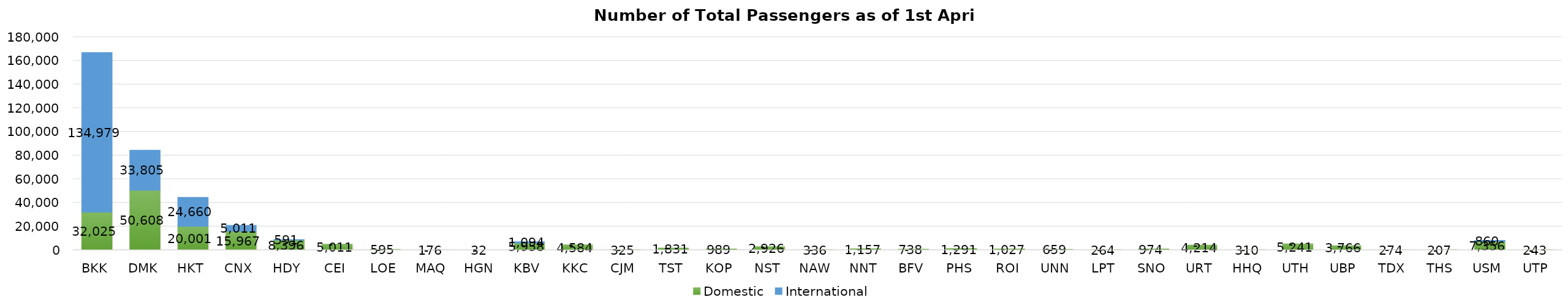
| Category | Domestic | International |
|---|---|---|
| BKK | 32025 | 134979 |
| DMK | 50608 | 33805 |
| HKT | 20001 | 24660 |
| CNX | 15967 | 5011 |
| HDY | 8396 | 591 |
| CEI | 5011 | 0 |
| LOE | 595 | 0 |
| MAQ | 176 | 0 |
| HGN | 32 | 0 |
| KBV | 5958 | 1094 |
| KKC | 4584 | 0 |
| CJM | 325 | 0 |
| TST | 1831 | 0 |
| KOP | 989 | 0 |
| NST | 2926 | 0 |
| NAW | 336 | 0 |
| NNT | 1157 | 0 |
| BFV | 738 | 0 |
| PHS | 1291 | 0 |
| ROI | 1027 | 0 |
| UNN | 659 | 0 |
| LPT | 264 | 0 |
| SNO | 974 | 0 |
| URT | 4214 | 0 |
| HHQ | 310 | 0 |
| UTH | 5241 | 0 |
| UBP | 3766 | 0 |
| TDX | 274 | 0 |
| THS | 207 | 0 |
| USM | 7356 | 860 |
| UTP | 243 | 0 |